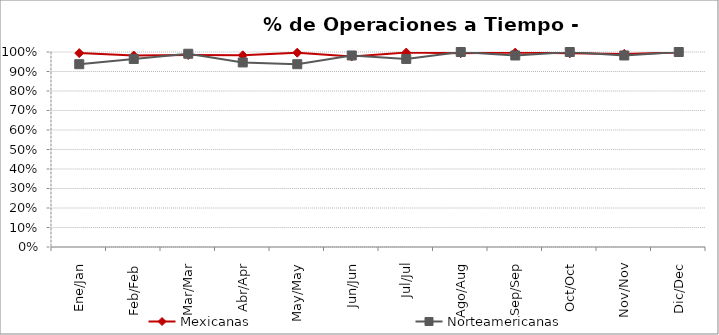
| Category | Mexicanas | Norteamericanas |
|---|---|---|
| Ene/Jan | 0.994 | 0.938 |
| Feb/Feb | 0.982 | 0.964 |
| Mar/Mar | 0.985 | 0.991 |
| Abr/Apr | 0.983 | 0.946 |
| May/May | 0.996 | 0.938 |
| Jun/Jun | 0.977 | 0.982 |
| Jul/Jul | 0.997 | 0.964 |
| Ago/Aug | 0.994 | 1 |
| Sep/Sep | 0.997 | 0.982 |
| Oct/Oct | 0.993 | 1 |
| Nov/Nov | 0.99 | 0.982 |
| Dic/Dec | 0.997 | 1 |